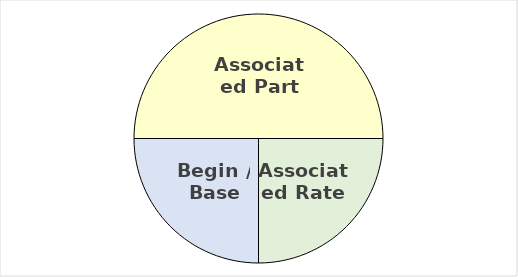
| Category | Series 0 |
|---|---|
| Associated Part | 0.5 |
| Associated Rate | 0.25 |
| Begin / Base | 0.25 |